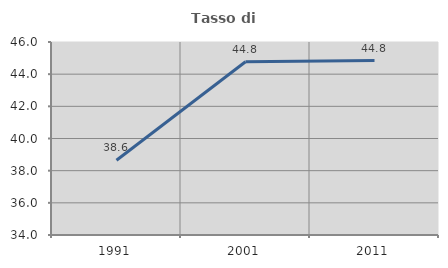
| Category | Tasso di occupazione   |
|---|---|
| 1991.0 | 38.645 |
| 2001.0 | 44.769 |
| 2011.0 | 44.844 |